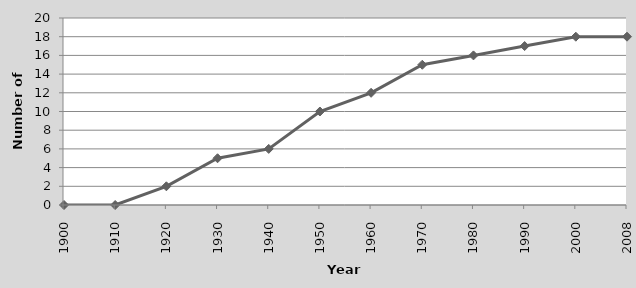
| Category | Number of countries |
|---|---|
| 1900.0 | 0 |
| 1910.0 | 0 |
| 1920.0 | 2 |
| 1930.0 | 5 |
| 1940.0 | 6 |
| 1950.0 | 10 |
| 1960.0 | 12 |
| 1970.0 | 15 |
| 1980.0 | 16 |
| 1990.0 | 17 |
| 2000.0 | 18 |
| 2008.0 | 18 |